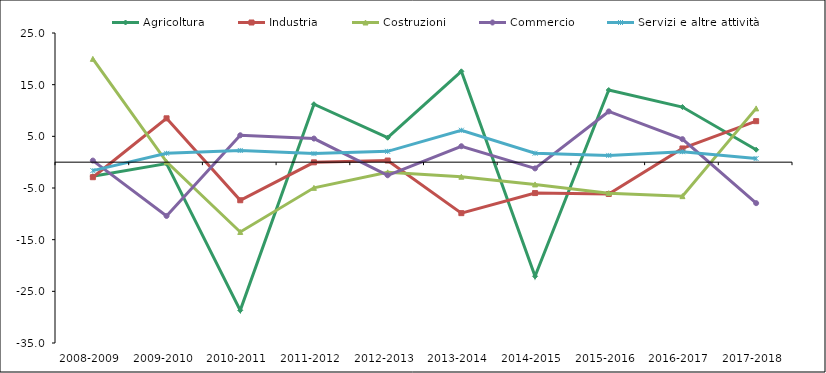
| Category | Agricoltura | Industria | Costruzioni | Commercio | Servizi e altre attività |
|---|---|---|---|---|---|
| 2008-2009 | -2.726 | -2.91 | 19.992 | 0.306 | -1.632 |
| 2009-2010 | -0.27 | 8.488 | 0.075 | -10.409 | 1.719 |
| 2010-2011 | -28.676 | -7.374 | -13.51 | 5.203 | 2.267 |
| 2011-2012 | 11.217 | -0.033 | -4.968 | 4.569 | 1.657 |
| 2012-2013 | 4.729 | 0.32 | -1.97 | -2.536 | 2.091 |
| 2013-2014 | 17.581 | -9.868 | -2.819 | 3.083 | 6.174 |
| 2014-2015 | -22.079 | -5.986 | -4.308 | -1.21 | 1.734 |
| 2015-2016 | 13.961 | -6.164 | -5.994 | 9.817 | 1.307 |
| 2016-2017 | 10.67 | 2.654 | -6.574 | 4.455 | 2.028 |
| 2017-2018 | 2.415 | 7.934 | 10.405 | -7.933 | 0.7 |